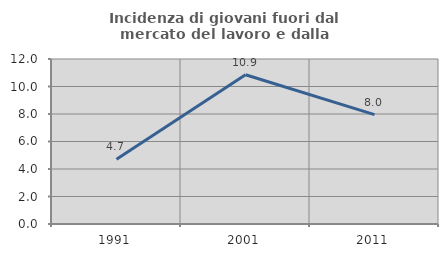
| Category | Incidenza di giovani fuori dal mercato del lavoro e dalla formazione  |
|---|---|
| 1991.0 | 4.717 |
| 2001.0 | 10.853 |
| 2011.0 | 7.955 |